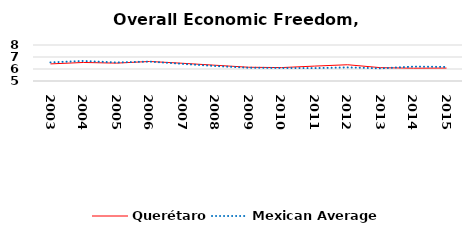
| Category | Querétaro | Mexican Average  |
|---|---|---|
| 2003.0 | 6.425 | 6.552 |
| 2004.0 | 6.544 | 6.668 |
| 2005.0 | 6.489 | 6.546 |
| 2006.0 | 6.627 | 6.619 |
| 2007.0 | 6.477 | 6.428 |
| 2008.0 | 6.312 | 6.248 |
| 2009.0 | 6.147 | 6.106 |
| 2010.0 | 6.118 | 6.086 |
| 2011.0 | 6.242 | 6.074 |
| 2012.0 | 6.355 | 6.134 |
| 2013.0 | 6.112 | 6.054 |
| 2014.0 | 6.067 | 6.2 |
| 2015.0 | 6.079 | 6.174 |